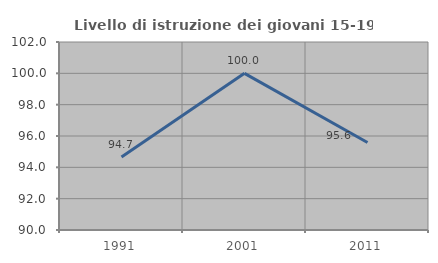
| Category | Livello di istruzione dei giovani 15-19 anni |
|---|---|
| 1991.0 | 94.656 |
| 2001.0 | 100 |
| 2011.0 | 95.588 |